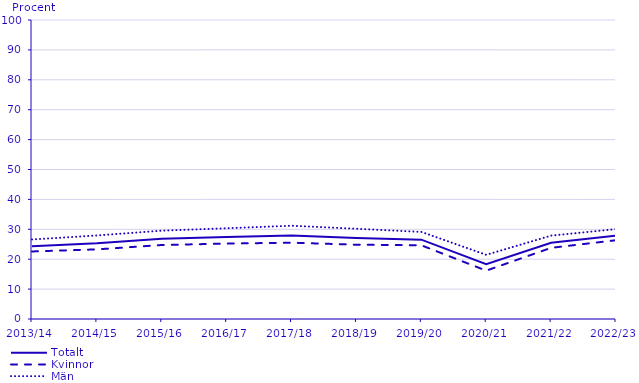
| Category | Totalt | Kvinnor | Män |
|---|---|---|---|
| 2013/14 | 24.319 | 22.588 | 26.594 |
| 2014/15 | 25.3 | 23.285 | 27.943 |
| 2015/16 | 26.809 | 24.749 | 29.544 |
| 2016/17 | 27.405 | 25.224 | 30.349 |
| 2017/18 | 27.913 | 25.53 | 31.195 |
| 2018/19 | 27.093 | 24.845 | 30.18 |
| 2019/20 | 26.537 | 24.65 | 29.123 |
| 2020/21 | 18.356 | 16.174 | 21.462 |
| 2021/22 | 25.494 | 23.798 | 27.885 |
| 2022/23 | 27.904 | 26.346 | 30.06 |